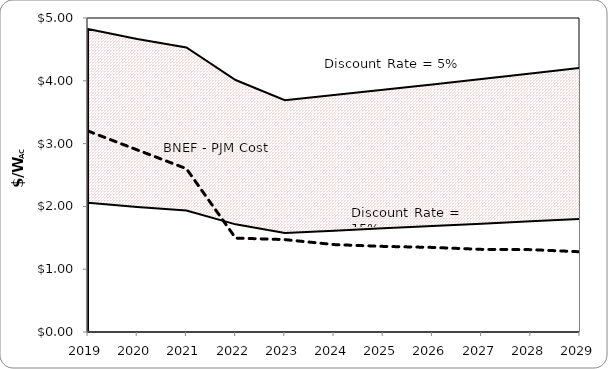
| Category | BNEF - PJM ($/WAC) |
|---|---|
| 2019.0 | 3.2 |
| 2020.0 | 2.9 |
| 2021.0 | 2.601 |
| 2022.0 | 1.495 |
| 2023.0 | 1.471 |
| 2024.0 | 1.392 |
| 2025.0 | 1.363 |
| 2026.0 | 1.347 |
| 2027.0 | 1.316 |
| 2028.0 | 1.312 |
| 2029.0 | 1.277 |